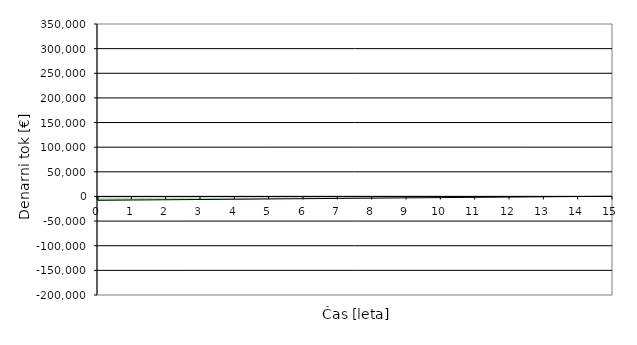
| Category | Series 0 |
|---|---|
| 0.0 | -7800 |
| 1.0 | -7252.975 |
| 2.0 | -6705.95 |
| 3.0 | -6158.925 |
| 4.0 | -5611.9 |
| 5.0 | -5064.875 |
| 6.0 | -4517.85 |
| 7.0 | -3970.825 |
| 8.0 | -3423.8 |
| 9.0 | -2876.775 |
| 10.0 | -2329.749 |
| 11.0 | -1782.724 |
| 12.0 | -1235.699 |
| 13.0 | -688.674 |
| 14.0 | -141.649 |
| 15.0 | 405.376 |